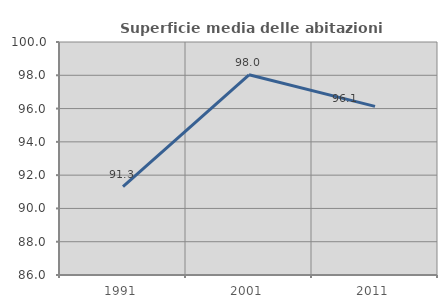
| Category | Superficie media delle abitazioni occupate |
|---|---|
| 1991.0 | 91.316 |
| 2001.0 | 98.028 |
| 2011.0 | 96.133 |